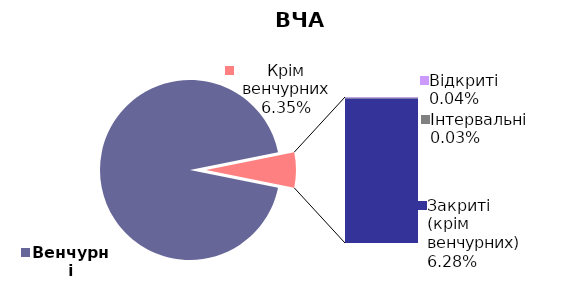
| Category | 31.03.2019 |
|---|---|
| Венчурні | 0.937 |
| Відкриті | 0 |
| Інтервальні | 0 |
| Закриті (крім венчурних) | 0.063 |